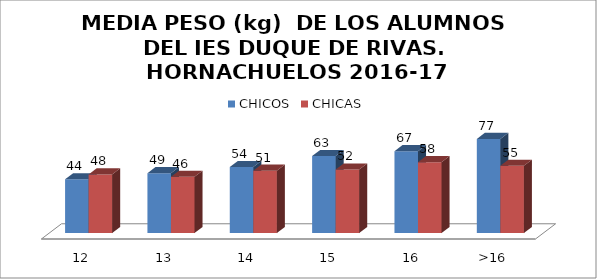
| Category | CHICOS | CHICAS |
|---|---|---|
| 12 | 44 | 48 |
| 13 | 49 | 46 |
| 14 | 54 | 51 |
| 15 | 63 | 52 |
| 16 | 67 | 58 |
| >16 | 77 | 55 |